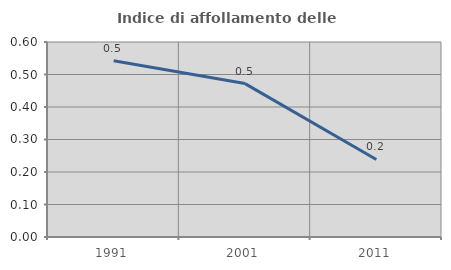
| Category | Indice di affollamento delle abitazioni  |
|---|---|
| 1991.0 | 0.542 |
| 2001.0 | 0.472 |
| 2011.0 | 0.239 |